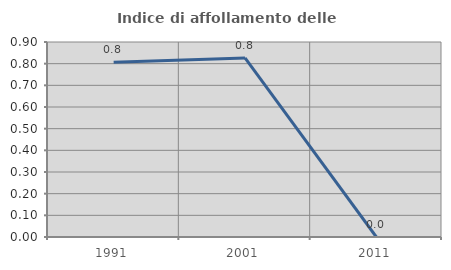
| Category | Indice di affollamento delle abitazioni  |
|---|---|
| 1991.0 | 0.806 |
| 2001.0 | 0.826 |
| 2011.0 | 0 |